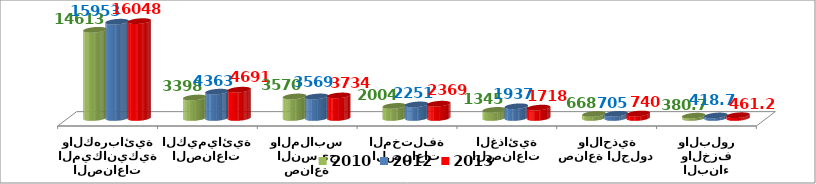
| Category | 2010 | 2012 | 2013 |
|---|---|---|---|
| الصناعات الميكانيكية والكهربائية | 14612.5 | 15952.9 | 16048 |
| الصناعات الكيميائية | 3397.7 | 4363.271 | 4691.222 |
| صناعة النسيج والملابس | 3569.5 | 3568.5 | 3733.8 |
| الصناعات المختلفة | 2004.1 | 2251.326 | 2369.341 |
| الصناعات الغذائية | 1344.8 | 1937.234 | 1717.505 |
| صناعة الجلود والاحذية | 667.8 | 704.7 | 739.6 |
| صناعات مواد البناء والخزف والبلور | 380.7 | 418.698 | 461.239 |